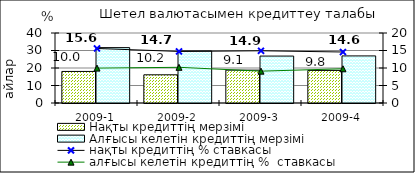
| Category | Нақты кредиттің мерзімі  | Алғысы келетін кредиттің мерзімі  |
|---|---|---|
| 2009-1 | 18.03 | 31.65 |
| 2009-2 | 16.11 | 29.71 |
| 2009-3 | 18.77 | 26.82 |
| 2009-4 | 18.61 | 26.91 |